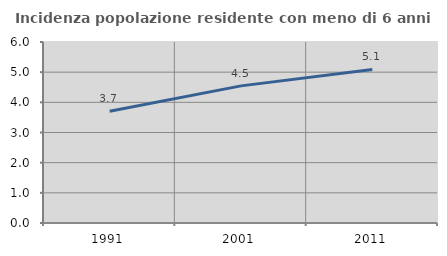
| Category | Incidenza popolazione residente con meno di 6 anni |
|---|---|
| 1991.0 | 3.706 |
| 2001.0 | 4.545 |
| 2011.0 | 5.091 |